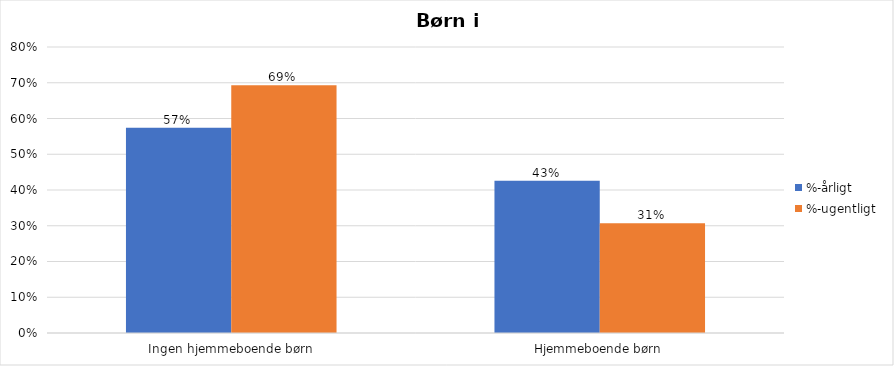
| Category | %-årligt | %-ugentligt |
|---|---|---|
| Ingen hjemmeboende børn | 0.574 | 0.693 |
| Hjemmeboende børn | 0.426 | 0.307 |